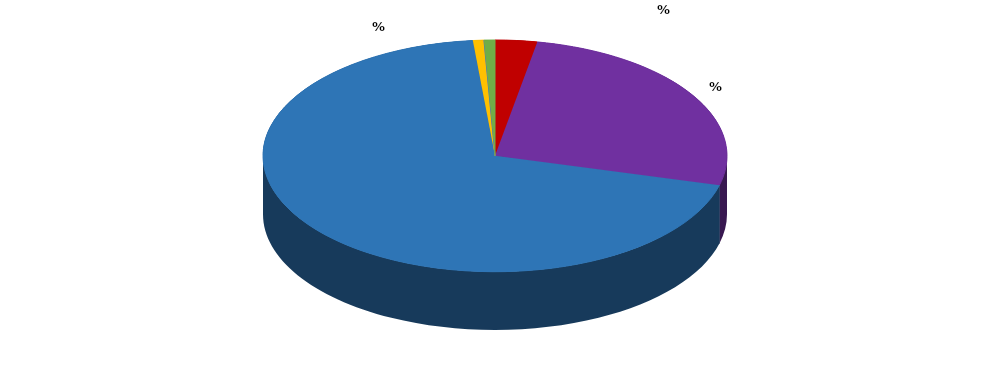
| Category | Series 0 |
|---|---|
| 0 | 0.03 |
| 1 | 0.265 |
| 2 | 0.704 |
| 3 | 0.008 |
| 4 | 0 |
| 5 | 0.008 |